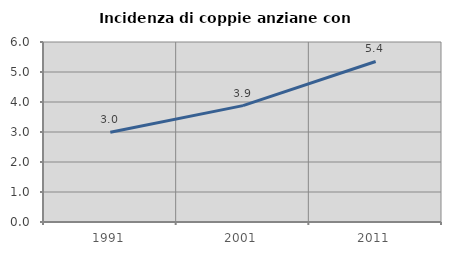
| Category | Incidenza di coppie anziane con figli |
|---|---|
| 1991.0 | 2.992 |
| 2001.0 | 3.879 |
| 2011.0 | 5.35 |